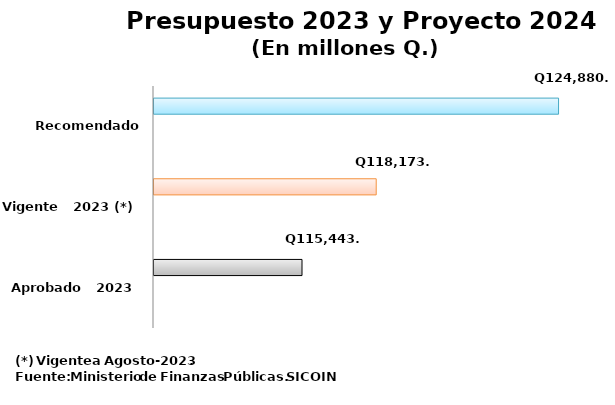
| Category | Series 0 | Series 2 | Series 3 |
|---|---|---|---|
| Aprobado   2023 |  |  | 115443.7 |
| Vigente   2023 (*) |  |  | 118173.4 |
| Recomendado 2024 |  |  | 124880 |